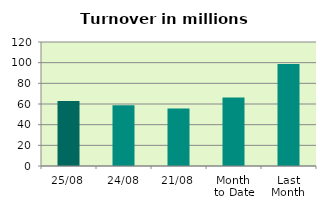
| Category | Series 0 |
|---|---|
| 25/08 | 62.975 |
| 24/08 | 58.682 |
| 21/08 | 55.536 |
| Month 
to Date | 66.365 |
| Last
Month | 98.668 |